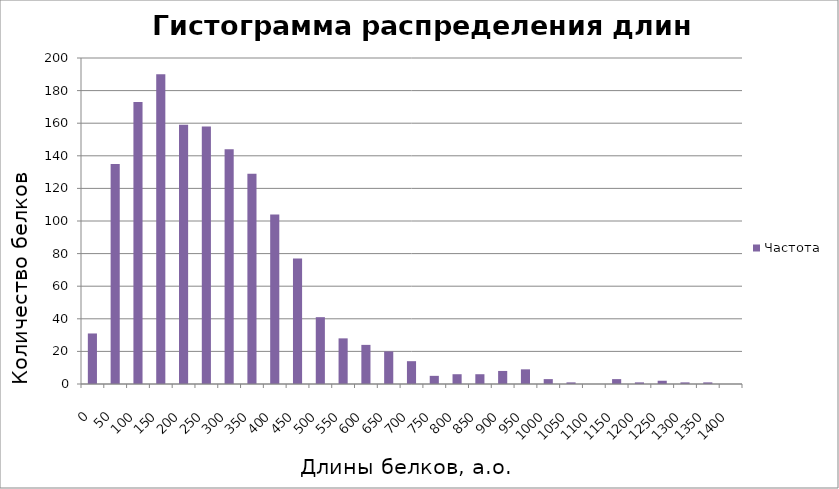
| Category | Частота |
|---|---|
| 0.0 | 31 |
| 50.0 | 135 |
| 100.0 | 173 |
| 150.0 | 190 |
| 200.0 | 159 |
| 250.0 | 158 |
| 300.0 | 144 |
| 350.0 | 129 |
| 400.0 | 104 |
| 450.0 | 77 |
| 500.0 | 41 |
| 550.0 | 28 |
| 600.0 | 24 |
| 650.0 | 20 |
| 700.0 | 14 |
| 750.0 | 5 |
| 800.0 | 6 |
| 850.0 | 6 |
| 900.0 | 8 |
| 950.0 | 9 |
| 1000.0 | 3 |
| 1050.0 | 1 |
| 1100.0 | 0 |
| 1150.0 | 3 |
| 1200.0 | 1 |
| 1250.0 | 2 |
| 1300.0 | 1 |
| 1350.0 | 1 |
| 1400.0 | 0 |